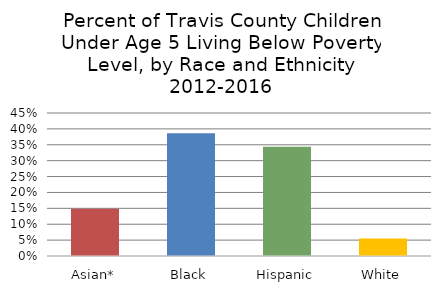
| Category | Series 0 |
|---|---|
| Asian* | 0.149 |
| Black | 0.386 |
| Hispanic | 0.344 |
| White | 0.055 |